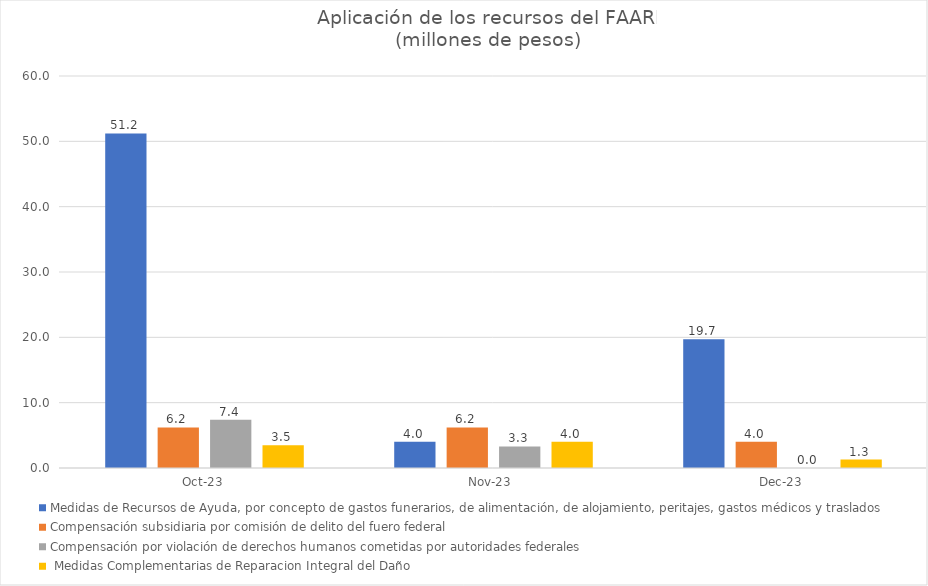
| Category | Medidas de Recursos de Ayuda, por concepto de gastos funerarios, de alimentación, de alojamiento, peritajes, gastos médicos y traslados | Compensación subsidiaria por comisión de delito del fuero federal | Compensación por violación de derechos humanos cometidas por autoridades federales |  Medidas Complementarias de Reparacion Integral del Daño |
|---|---|---|---|---|
| 2023-10-01 | 51.2 | 6.2 | 7.4 | 3.5 |
| 2023-11-01 | 4 | 6.2 | 3.3 | 4 |
| 2023-12-01 | 19.7 | 4 | 0 | 1.3 |